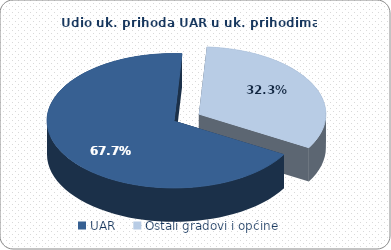
| Category | Series 0 |
|---|---|
| UAR | 27715578.736 |
| Ostali gradovi i općine | 13244010.131 |